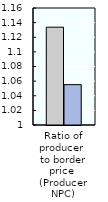
| Category | 2000-02 | 2018-20 |
|---|---|---|
| Ratio of producer 
to border price 
(Producer NPC) | 1.134 | 1.055 |